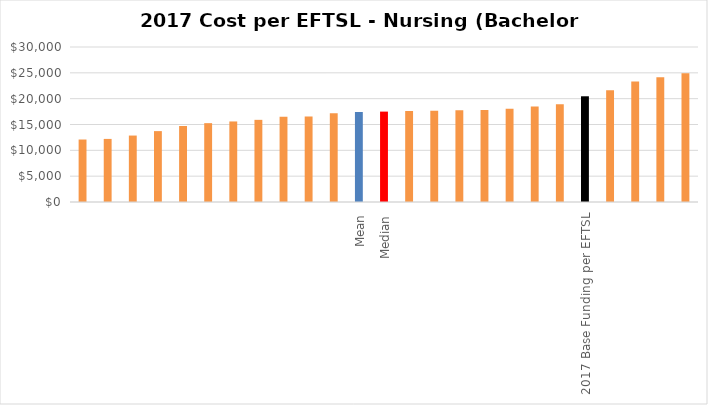
| Category | Series 0 |
|---|---|
|  | 12092.828 |
|  | 12210.305 |
|  | 12860.387 |
|  | 13719.26 |
|  | 14715.714 |
|  | 15260.022 |
|  | 15589.173 |
|  | 15901.167 |
|  | 16522.911 |
|  | 16559.887 |
|  | 17166.493 |
| Mean | 17409 |
| Median | 17495.476 |
|  | 17594.757 |
|  | 17643.134 |
|  | 17774.187 |
|  | 17790.431 |
|  | 18071.262 |
|  | 18502.732 |
|  | 18935.255 |
| 2017 Base Funding per EFTSL | 20462 |